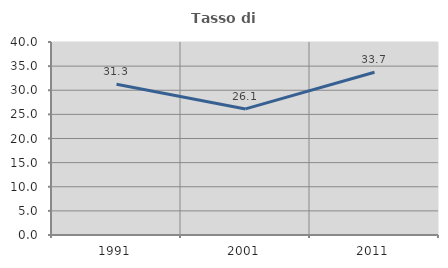
| Category | Tasso di occupazione   |
|---|---|
| 1991.0 | 31.26 |
| 2001.0 | 26.132 |
| 2011.0 | 33.72 |